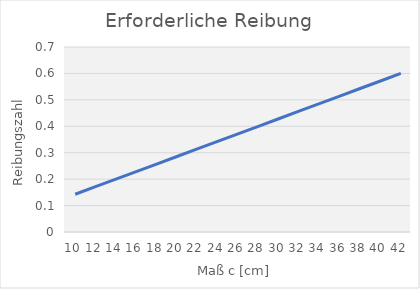
| Category | Series 0 |
|---|---|
| 10.0 | 0.143 |
| 12.0 | 0.171 |
| 14.0 | 0.2 |
| 16.0 | 0.229 |
| 18.0 | 0.257 |
| 20.0 | 0.286 |
| 22.0 | 0.314 |
| 24.0 | 0.343 |
| 26.0 | 0.371 |
| 28.0 | 0.4 |
| 30.0 | 0.429 |
| 32.0 | 0.457 |
| 34.0 | 0.486 |
| 36.0 | 0.514 |
| 38.0 | 0.543 |
| 40.0 | 0.571 |
| 42.0 | 0.6 |